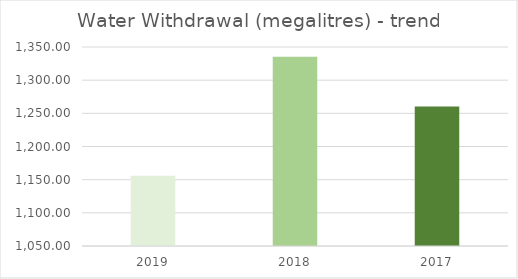
| Category | Series 0 |
|---|---|
| 0 | 1155.91 |
| 1 | 1335.27 |
| 2 | 1260.32 |